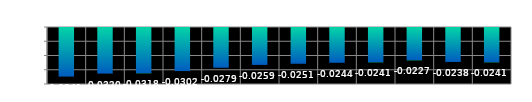
| Category | Series 0 |
|---|---|
| 0 | -0.034 |
| 1 | -0.032 |
| 2 | -0.032 |
| 3 | -0.03 |
| 4 | -0.028 |
| 5 | -0.026 |
| 6 | -0.025 |
| 7 | -0.024 |
| 8 | -0.024 |
| 9 | -0.023 |
| 10 | -0.024 |
| 11 | -0.024 |